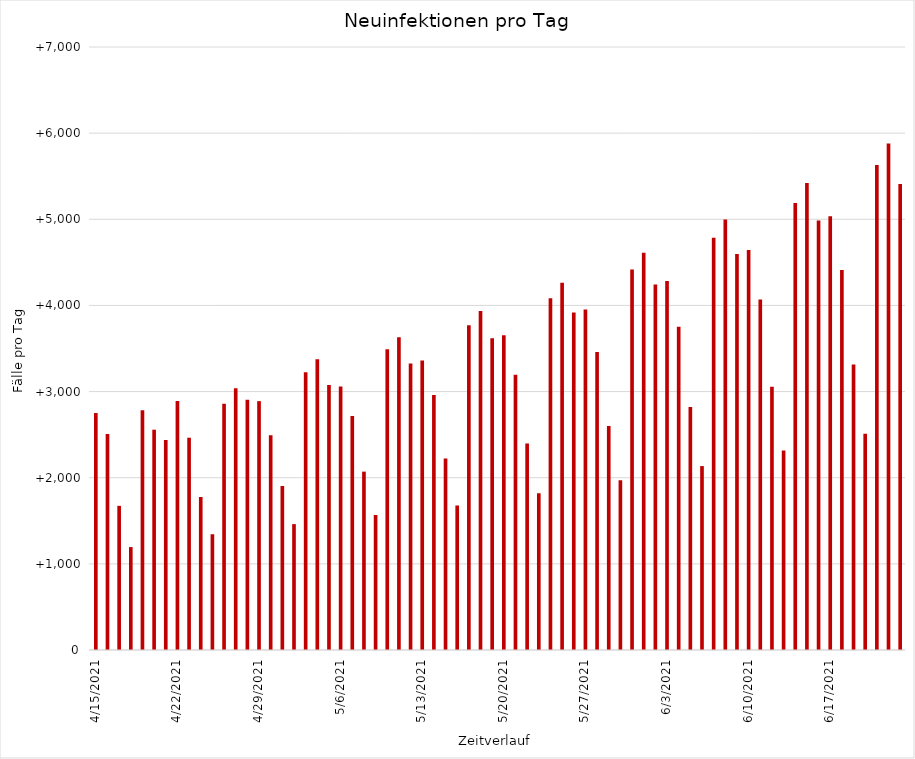
| Category | Pro Tag |
|---|---|
| 4/15/21 | 2750.856 |
| 4/16/21 | 2508.081 |
| 4/17/21 | 1673.486 |
| 4/18/21 | 1194.773 |
| 4/19/21 | 2782.077 |
| 4/20/21 | 2557.388 |
| 4/21/21 | 2437.13 |
| 4/22/21 | 2890.316 |
| 4/23/21 | 2464.488 |
| 4/24/21 | 1775.418 |
| 4/25/21 | 1343.882 |
| 4/26/21 | 2858.759 |
| 4/27/21 | 3037.731 |
| 4/28/21 | 2903.647 |
| 4/29/21 | 2888.991 |
| 4/30/21 | 2492.321 |
| 5/1/21 | 1902.95 |
| 5/2/21 | 1461.422 |
| 5/3/21 | 3223.59 |
| 5/4/21 | 3376.584 |
| 5/5/21 | 3076.058 |
| 5/6/21 | 3059.629 |
| 5/7/21 | 2717.099 |
| 5/8/21 | 2070.656 |
| 5/9/21 | 1566.514 |
| 5/10/21 | 3492.031 |
| 5/11/21 | 3629.222 |
| 5/12/21 | 3324.719 |
| 5/13/21 | 3361.618 |
| 5/14/21 | 2960.229 |
| 5/15/21 | 2221.848 |
| 5/16/21 | 1678.663 |
| 5/17/21 | 3769.119 |
| 5/18/21 | 3936.296 |
| 5/19/21 | 3619.943 |
| 5/20/21 | 3653.27 |
| 5/21/21 | 3194.189 |
| 5/22/21 | 2397.357 |
| 5/23/21 | 1818.242 |
| 5/24/21 | 4083.275 |
| 5/25/21 | 4263.054 |
| 5/26/21 | 3917.548 |
| 5/27/21 | 3951.974 |
| 5/28/21 | 3459.9 |
| 5/29/21 | 2601.139 |
| 5/30/21 | 1971.223 |
| 5/31/21 | 4418.041 |
| 6/1/21 | 4611.837 |
| 6/2/21 | 4241.579 |
| 6/3/21 | 4283.279 |
| 6/4/21 | 3752.65 |
| 6/5/21 | 2819.79 |
| 6/6/21 | 2135.137 |
| 6/7/21 | 4785.46 |
| 6/8/21 | 4998.012 |
| 6/9/21 | 4598.12 |
| 6/10/21 | 4643.266 |
| 6/11/21 | 4067.664 |
| 6/12/21 | 3056.403 |
| 6/13/21 | 2314.922 |
| 6/14/21 | 5189.927 |
| 6/15/21 | 5420.152 |
| 6/16/21 | 4985.65 |
| 6/17/21 | 5034.561 |
| 6/18/21 | 4411.235 |
| 6/19/21 | 3315.374 |
| 6/20/21 | 2511.453 |
| 6/21/21 | 5630.45 |
| 6/22/21 | 5879.86 |
| 6/23/21 | 5408.825 |